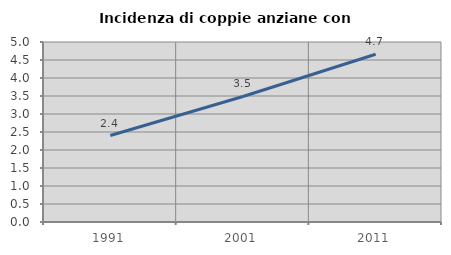
| Category | Incidenza di coppie anziane con figli |
|---|---|
| 1991.0 | 2.402 |
| 2001.0 | 3.486 |
| 2011.0 | 4.66 |